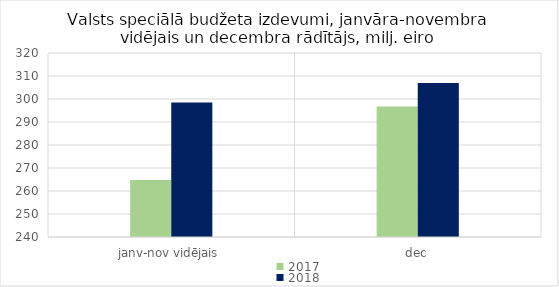
| Category | 2017 | 2018 |
|---|---|---|
| janv-nov vidējais | 264809.109 | 298428.976 |
| dec | 296686.983 | 306911.749 |